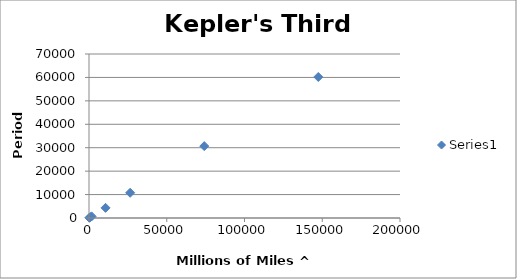
| Category | Series 0 |
|---|---|
| 216.00000000000006 | 88 |
| 551.491004573057 | 224.7 |
| 896.8595207723453 | 365.3 |
| 1687.6586175453274 | 687 |
| 10641.400681865145 | 4331.8 |
| 26460.463061661863 | 10760 |
| 74119.50223203741 | 30684 |
| 147452.25716849056 | 60188.3 |